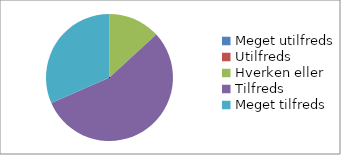
| Category | Hvor tilfreds er du med gruppearbejdet? (n=38) |
|---|---|
| Meget utilfreds | 0 |
| Utilfreds | 0 |
| Hverken eller | 0.132 |
| Tilfreds | 0.553 |
| Meget tilfreds | 0.316 |